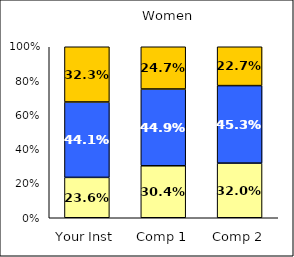
| Category | Low Academic Adjustment | Average Academic Adjustment | High Academic Adjustment |
|---|---|---|---|
| Your Inst | 0.236 | 0.441 | 0.323 |
| Comp 1 | 0.304 | 0.449 | 0.247 |
| Comp 2 | 0.32 | 0.453 | 0.227 |